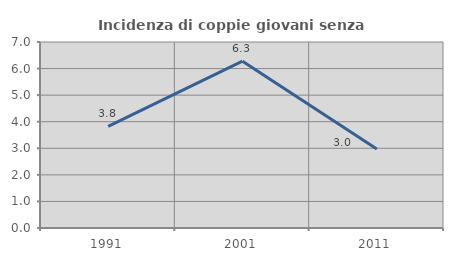
| Category | Incidenza di coppie giovani senza figli |
|---|---|
| 1991.0 | 3.828 |
| 2001.0 | 6.278 |
| 2011.0 | 2.97 |